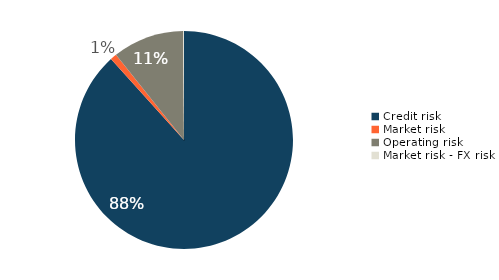
| Category | Series 0 |
|---|---|
| Credit risk | 0.883 |
| Market risk | 0.01 |
| Operating risk | 0.106 |
| Market risk - FX risk | 0.001 |